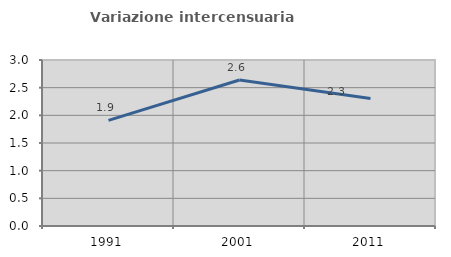
| Category | Variazione intercensuaria annua |
|---|---|
| 1991.0 | 1.909 |
| 2001.0 | 2.64 |
| 2011.0 | 2.304 |